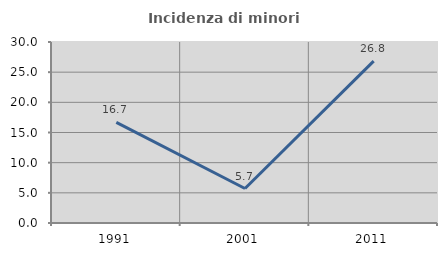
| Category | Incidenza di minori stranieri |
|---|---|
| 1991.0 | 16.667 |
| 2001.0 | 5.714 |
| 2011.0 | 26.829 |